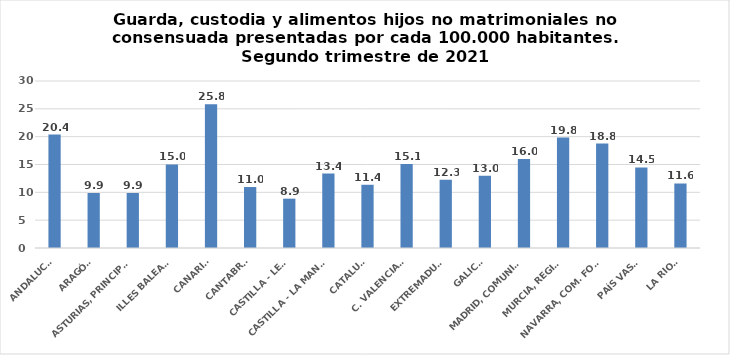
| Category | Series 0 |
|---|---|
| ANDALUCÍA | 20.371 |
| ARAGÓN | 9.884 |
| ASTURIAS, PRINCIPADO | 9.886 |
| ILLES BALEARS | 15.013 |
| CANARIAS | 25.836 |
| CANTABRIA | 10.953 |
| CASTILLA - LEÓN | 8.861 |
| CASTILLA - LA MANCHA | 13.38 |
| CATALUÑA | 11.358 |
| C. VALENCIANA | 15.111 |
| EXTREMADURA | 12.278 |
| GALICIA | 12.991 |
| MADRID, COMUNIDAD | 15.996 |
| MURCIA, REGIÓN | 19.83 |
| NAVARRA, COM. FORAL | 18.759 |
| PAÍS VASCO | 14.463 |
| LA RIOJA | 11.591 |